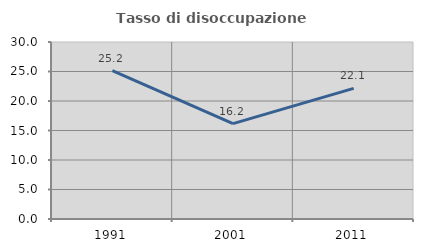
| Category | Tasso di disoccupazione giovanile  |
|---|---|
| 1991.0 | 25.152 |
| 2001.0 | 16.159 |
| 2011.0 | 22.146 |